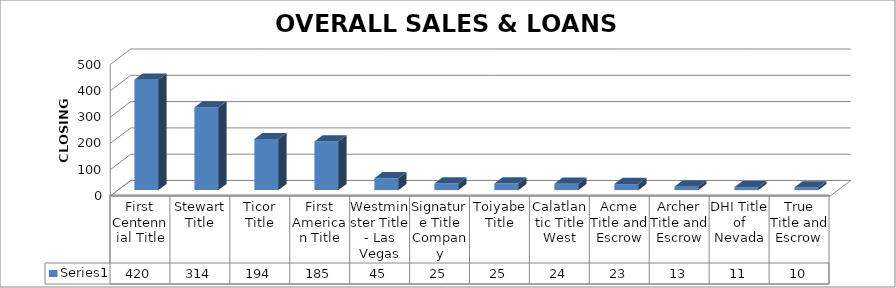
| Category | Series 0 |
|---|---|
| First Centennial Title | 420 |
| Stewart Title | 314 |
| Ticor Title | 194 |
| First American Title | 185 |
| Westminster Title - Las Vegas | 45 |
| Signature Title Company | 25 |
| Toiyabe Title | 25 |
| Calatlantic Title West | 24 |
| Acme Title and Escrow | 23 |
| Archer Title and Escrow | 13 |
| DHI Title of Nevada | 11 |
| True Title and Escrow | 10 |